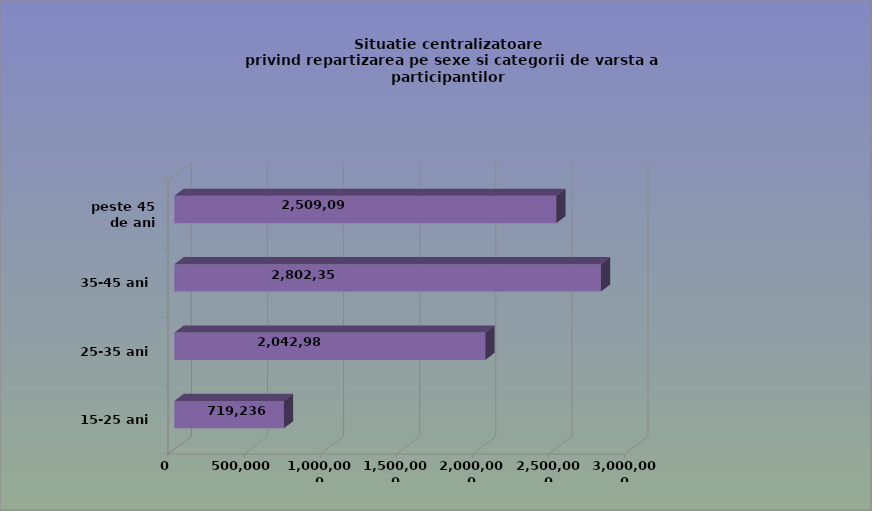
| Category | 15-25 ani 25-35 ani 35-45 ani peste 45 de ani |
|---|---|
| 15-25 ani | 719236 |
| 25-35 ani | 2042986 |
| 35-45 ani | 2802352 |
| peste 45 de ani | 2509091 |